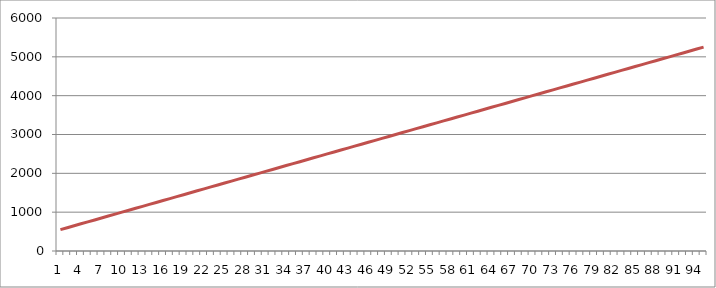
| Category | Series 1 |
|---|---|
| 0 | 550 |
| 1 | 600 |
| 2 | 650 |
| 3 | 700 |
| 4 | 750 |
| 5 | 800 |
| 6 | 850 |
| 7 | 900 |
| 8 | 950 |
| 9 | 1000 |
| 10 | 1050 |
| 11 | 1100 |
| 12 | 1150 |
| 13 | 1200 |
| 14 | 1250 |
| 15 | 1300 |
| 16 | 1350 |
| 17 | 1400 |
| 18 | 1450 |
| 19 | 1500 |
| 20 | 1550 |
| 21 | 1600 |
| 22 | 1650 |
| 23 | 1700 |
| 24 | 1750 |
| 25 | 1800 |
| 26 | 1850 |
| 27 | 1900 |
| 28 | 1950 |
| 29 | 2000 |
| 30 | 2050 |
| 31 | 2100 |
| 32 | 2150 |
| 33 | 2200 |
| 34 | 2250 |
| 35 | 2300 |
| 36 | 2350 |
| 37 | 2400 |
| 38 | 2450 |
| 39 | 2500 |
| 40 | 2550 |
| 41 | 2600 |
| 42 | 2650 |
| 43 | 2700 |
| 44 | 2750 |
| 45 | 2800 |
| 46 | 2850 |
| 47 | 2900 |
| 48 | 2950 |
| 49 | 3000 |
| 50 | 3050 |
| 51 | 3100 |
| 52 | 3150 |
| 53 | 3200 |
| 54 | 3250 |
| 55 | 3300 |
| 56 | 3350 |
| 57 | 3400 |
| 58 | 3450 |
| 59 | 3500 |
| 60 | 3550 |
| 61 | 3600 |
| 62 | 3650 |
| 63 | 3700 |
| 64 | 3750 |
| 65 | 3800 |
| 66 | 3850 |
| 67 | 3900 |
| 68 | 3950 |
| 69 | 4000 |
| 70 | 4050 |
| 71 | 4100 |
| 72 | 4150 |
| 73 | 4200 |
| 74 | 4250 |
| 75 | 4300 |
| 76 | 4350 |
| 77 | 4400 |
| 78 | 4450 |
| 79 | 4500 |
| 80 | 4550 |
| 81 | 4600 |
| 82 | 4650 |
| 83 | 4700 |
| 84 | 4750 |
| 85 | 4800 |
| 86 | 4850 |
| 87 | 4900 |
| 88 | 4950 |
| 89 | 5000 |
| 90 | 5050 |
| 91 | 5100 |
| 92 | 5150 |
| 93 | 5200 |
| 94 | 5250 |